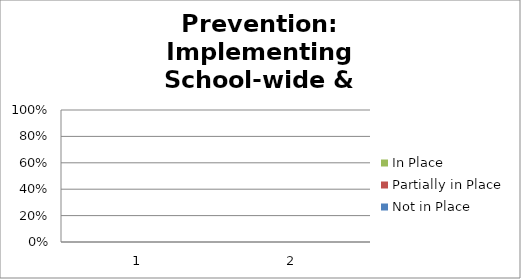
| Category | Not in Place | Partially in Place | In Place |
|---|---|---|---|
| 0 | 0 | 0 | 0 |
| 1900-01-01 | 0 | 0 | 0 |